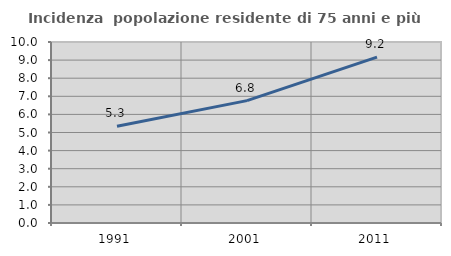
| Category | Incidenza  popolazione residente di 75 anni e più |
|---|---|
| 1991.0 | 5.342 |
| 2001.0 | 6.761 |
| 2011.0 | 9.168 |